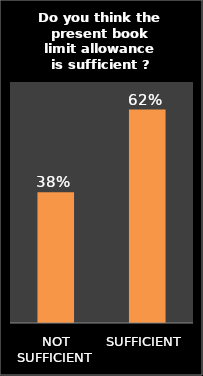
| Category | Series 0 |
|---|---|
| NOT SUFFICIENT | 0.38 |
| SUFFICIENT | 0.62 |